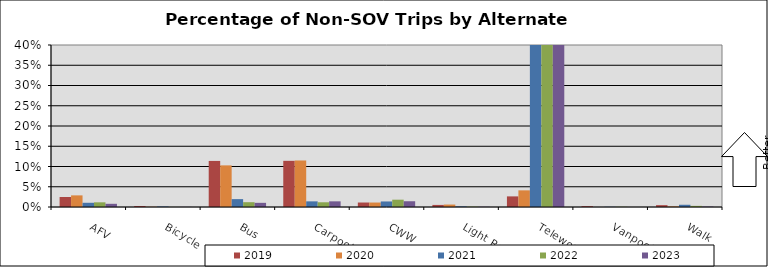
| Category | 2019 | 2020 | 2021 | 2022 | 2023 |
|---|---|---|---|---|---|
| AFV | 0.025 | 0.029 | 0.01 | 0.012 | 0.008 |
| Bicycle | 0.002 | 0.001 | 0.001 | 0 | 0 |
| Bus | 0.114 | 0.103 | 0.019 | 0.012 | 0.01 |
| Carpool | 0.114 | 0.115 | 0.014 | 0.012 | 0.014 |
| CWW | 0.011 | 0.011 | 0.014 | 0.018 | 0.014 |
| Light Rail | 0.005 | 0.006 | 0.002 | 0.001 | 0.001 |
| Telework | 0.026 | 0.041 | 0.735 | 0.754 | 0.789 |
| Vanpool | 0.002 | 0 | 0.001 | 0.001 | 0 |
| Walk | 0.005 | 0.002 | 0.006 | 0.003 | 0.001 |